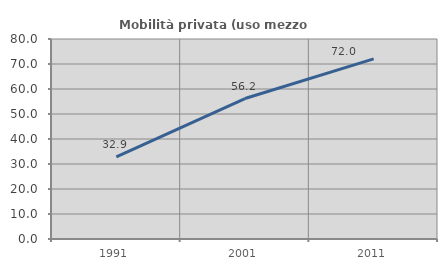
| Category | Mobilità privata (uso mezzo privato) |
|---|---|
| 1991.0 | 32.888 |
| 2001.0 | 56.187 |
| 2011.0 | 72.036 |